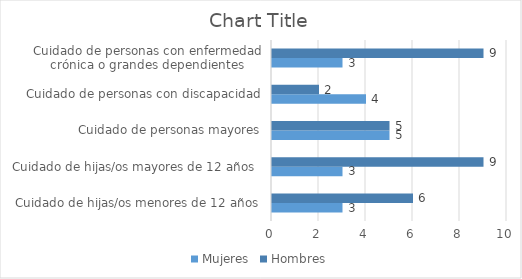
| Category | Mujeres | Hombres |
|---|---|---|
| Cuidado de hijas/os menores de 12 años | 3 | 6 |
| Cuidado de hijas/os mayores de 12 años  | 3 | 9 |
| Cuidado de personas mayores | 5 | 5 |
| Cuidado de personas con discapacidad | 4 | 2 |
| Cuidado de personas con enfermedad crónica o grandes dependientes | 3 | 9 |